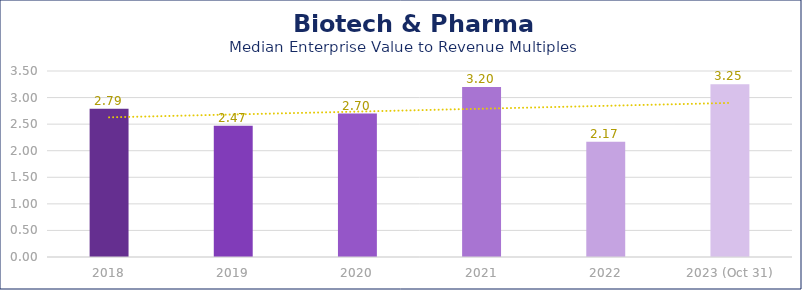
| Category | Biotech & Pharma |
|---|---|
| 2018 | 2.79 |
| 2019 | 2.47 |
| 2020 | 2.7 |
| 2021 | 3.2 |
| 2022 | 2.17 |
| 2023 (Oct 31) | 3.25 |